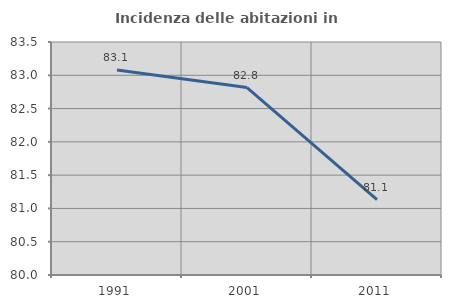
| Category | Incidenza delle abitazioni in proprietà  |
|---|---|
| 1991.0 | 83.078 |
| 2001.0 | 82.816 |
| 2011.0 | 81.133 |